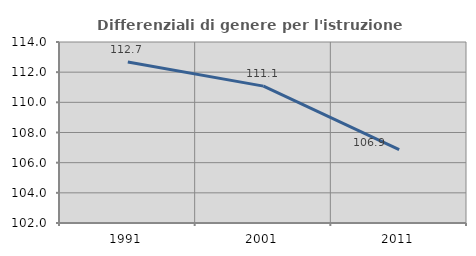
| Category | Differenziali di genere per l'istruzione superiore |
|---|---|
| 1991.0 | 112.667 |
| 2001.0 | 111.075 |
| 2011.0 | 106.864 |